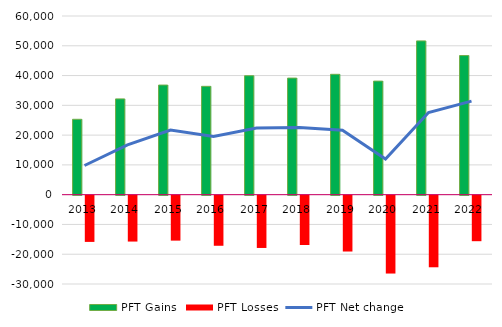
| Category | PFT Gains  | PFT Losses |
|---|---|---|
| 2013 | 25315 | -15528 |
| 2014 | 32166 | -15413 |
| 2015 | 36803 | -15099 |
| 2016 | 36382 | -16826 |
| 2017 | 39947 | -17561 |
| 2018 | 39145 | -16574 |
| 2019 | 40414 | -18758 |
| 2020 | 38134 | -26152 |
| 2021 | 51637 | -24050 |
| 2022 | 46719 | -15290 |